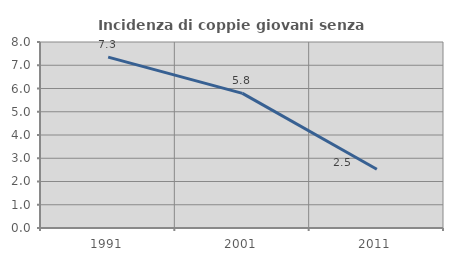
| Category | Incidenza di coppie giovani senza figli |
|---|---|
| 1991.0 | 7.349 |
| 2001.0 | 5.791 |
| 2011.0 | 2.53 |